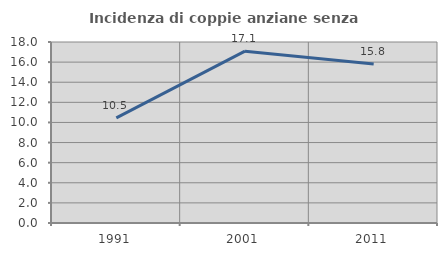
| Category | Incidenza di coppie anziane senza figli  |
|---|---|
| 1991.0 | 10.458 |
| 2001.0 | 17.089 |
| 2011.0 | 15.805 |